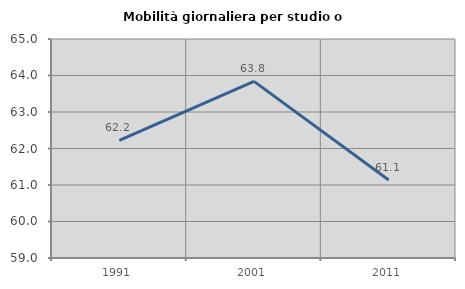
| Category | Mobilità giornaliera per studio o lavoro |
|---|---|
| 1991.0 | 62.226 |
| 2001.0 | 63.84 |
| 2011.0 | 61.137 |